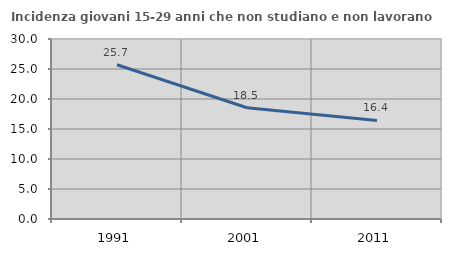
| Category | Incidenza giovani 15-29 anni che non studiano e non lavorano  |
|---|---|
| 1991.0 | 25.708 |
| 2001.0 | 18.543 |
| 2011.0 | 16.418 |